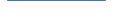
| Category | Series 0 |
|---|---|
| 0 | 91 |
| 1 | 64 |
| 2 | 66 |
| 3 | 82 |
| 4 | 73 |
| 5 | 60 |
| 6 | 42 |
| 7 | 65 |
| 8 | 56 |